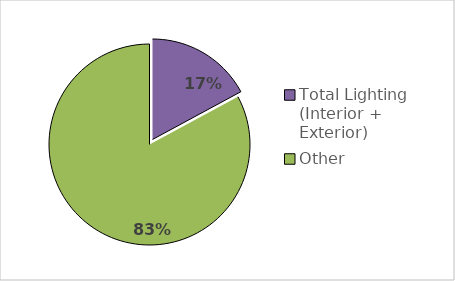
| Category | Series 0 |
|---|---|
| Total Lighting (Interior + Exterior) | 148 |
| Other | 717 |